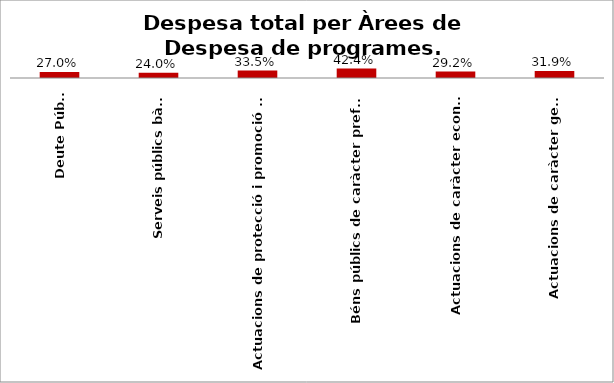
| Category | Series 0 |
|---|---|
| Deute Públic | 0.27 |
| Serveis públics bàsics | 0.24 |
| Actuacions de protecció i promoció social | 0.335 |
| Béns públics de caràcter preferent | 0.424 |
| Actuacions de caràcter econòmic | 0.292 |
| Actuacions de caràcter general | 0.319 |